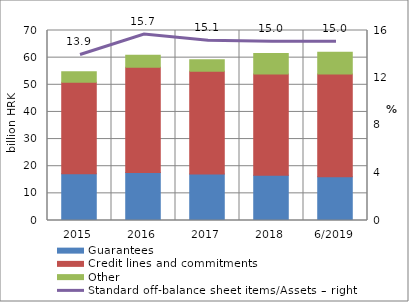
| Category | Guarantees | Credit lines and commitments | Other |
|---|---|---|---|
| 2015 | 17.228 | 33.691 | 3.91 |
| 2016 | 17.713 | 38.773 | 4.381 |
| 2017 | 17.105 | 37.875 | 4.278 |
| 2018 | 16.691 | 37.267 | 7.544 |
| 6/2019 | 16.125 | 37.861 | 7.997 |